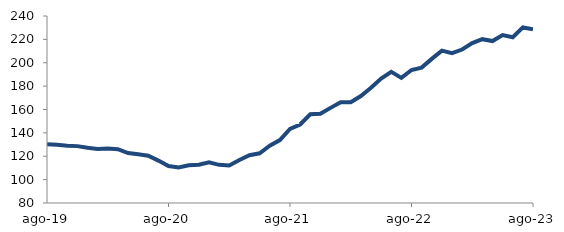
| Category | Series 0 |
|---|---|
| 2019-08-01 | 130.323 |
| 2019-09-01 | 129.814 |
| 2019-10-01 | 129.013 |
| 2019-11-01 | 128.663 |
| 2019-12-01 | 127.192 |
| 2020-01-01 | 126.144 |
| 2020-02-01 | 126.638 |
| 2020-03-01 | 125.992 |
| 2020-04-01 | 122.726 |
| 2020-05-01 | 121.669 |
| 2020-06-01 | 120.485 |
| 2020-07-01 | 116.268 |
| 2020-08-01 | 111.597 |
| 2020-09-01 | 110.39 |
| 2020-10-01 | 112.229 |
| 2020-11-01 | 112.769 |
| 2020-12-01 | 114.741 |
| 2021-01-01 | 112.625 |
| 2021-02-01 | 112.14 |
| 2021-03-01 | 116.74 |
| 2021-04-01 | 120.911 |
| 2021-05-01 | 122.536 |
| 2021-06-01 | 128.968 |
| 2021-07-01 | 133.864 |
| 2021-08-01 | 143.384 |
| 2021-09-01 | 147.196 |
| 2021-10-01 | 155.883 |
| 2021-11-01 | 156.426 |
| 2021-12-01 | 161.4 |
| 2022-01-01 | 166.276 |
| 2022-02-01 | 166.219 |
| 2022-03-01 | 171.531 |
| 2022-04-01 | 178.644 |
| 2022-05-01 | 186.465 |
| 2022-06-01 | 192.187 |
| 2022-07-01 | 187.044 |
| 2022-08-01 | 193.806 |
| 2022-09-01 | 195.846 |
| 2022-10-01 | 203.287 |
| 2022-11-01 | 210.344 |
| 2022-12-01 | 208.16 |
| 2023-01-01 | 211.29 |
| 2023-02-01 | 216.772 |
| 2023-03-01 | 220.156 |
| 2023-04-01 | 218.537 |
| 2023-05-01 | 223.702 |
| 2023-06-01 | 221.798 |
| 2023-07-01 | 230.236 |
| 2023-08-01 | 228.637 |